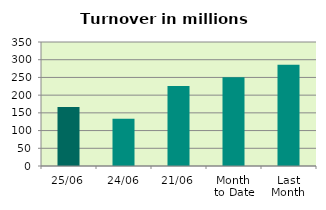
| Category | Series 0 |
|---|---|
| 25/06 | 166.332 |
| 24/06 | 133.452 |
| 21/06 | 226.131 |
| Month 
to Date | 250.572 |
| Last
Month | 285.992 |